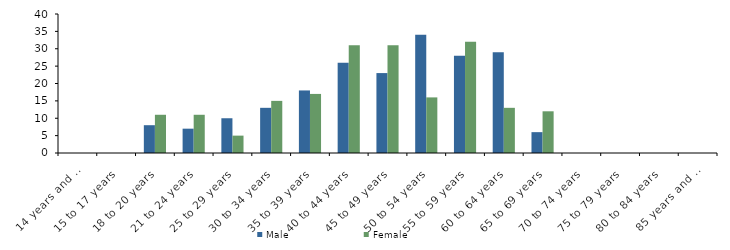
| Category | Male | Female |
|---|---|---|
| 14 years and under | 0 | 0 |
| 15 to 17 years | 0 | 0 |
| 18 to 20 years | 8 | 11 |
| 21 to 24 years | 7 | 11 |
| 25 to 29 years | 10 | 5 |
| 30 to 34 years | 13 | 15 |
| 35 to 39 years | 18 | 17 |
| 40 to 44 years | 26 | 31 |
| 45 to 49 years | 23 | 31 |
| 50 to 54 years | 34 | 16 |
| 55 to 59 years | 28 | 32 |
| 60 to 64 years | 29 | 13 |
| 65 to 69 years | 6 | 12 |
| 70 to 74 years | 0 | 0 |
| 75 to 79 years | 0 | 0 |
| 80 to 84 years | 0 | 0 |
| 85 years and over | 0 | 0 |